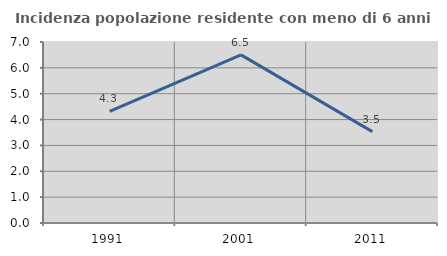
| Category | Incidenza popolazione residente con meno di 6 anni |
|---|---|
| 1991.0 | 4.317 |
| 2001.0 | 6.502 |
| 2011.0 | 3.535 |